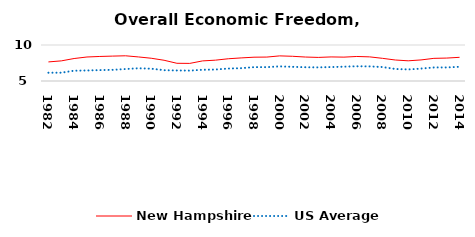
| Category | New Hampshire | US Average |
|---|---|---|
| 1982.0 | 7.65 | 6.149 |
| 1983.0 | 7.794 | 6.152 |
| 1984.0 | 8.121 | 6.429 |
| 1985.0 | 8.334 | 6.464 |
| 1986.0 | 8.409 | 6.512 |
| 1987.0 | 8.458 | 6.552 |
| 1988.0 | 8.502 | 6.659 |
| 1989.0 | 8.344 | 6.767 |
| 1990.0 | 8.16 | 6.71 |
| 1991.0 | 7.881 | 6.502 |
| 1992.0 | 7.46 | 6.463 |
| 1993.0 | 7.444 | 6.446 |
| 1994.0 | 7.792 | 6.563 |
| 1995.0 | 7.893 | 6.593 |
| 1996.0 | 8.089 | 6.73 |
| 1997.0 | 8.207 | 6.781 |
| 1998.0 | 8.307 | 6.926 |
| 1999.0 | 8.323 | 6.925 |
| 2000.0 | 8.489 | 7.031 |
| 2001.0 | 8.433 | 6.969 |
| 2002.0 | 8.328 | 6.912 |
| 2003.0 | 8.276 | 6.892 |
| 2004.0 | 8.343 | 6.934 |
| 2005.0 | 8.315 | 6.99 |
| 2006.0 | 8.405 | 7.048 |
| 2007.0 | 8.353 | 7.028 |
| 2008.0 | 8.149 | 6.935 |
| 2009.0 | 7.915 | 6.668 |
| 2010.0 | 7.805 | 6.605 |
| 2011.0 | 7.927 | 6.72 |
| 2012.0 | 8.147 | 6.883 |
| 2013.0 | 8.185 | 6.881 |
| 2014.0 | 8.289 | 6.973 |